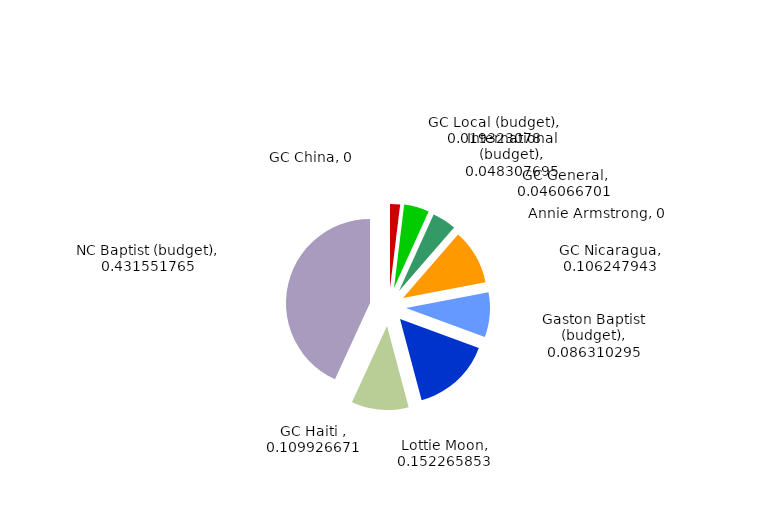
| Category | Percentage | Mission Names |
|---|---|---|
| GC China | 0 | 0 |
| GC Local (budget) | 0.019 | 0 |
| International (budget) | 0.048 | 0 |
| GC General | 0.046 | 0 |
| Annie Armstrong | 0 | 0 |
| GC Nicaragua | 0.106 | 0 |
| Gaston Baptist (budget) | 0.086 | 0 |
| Lottie Moon | 0.152 | 0 |
| GC Haiti  | 0.11 | 0 |
| NC Baptist (budget) | 0.432 | 0 |